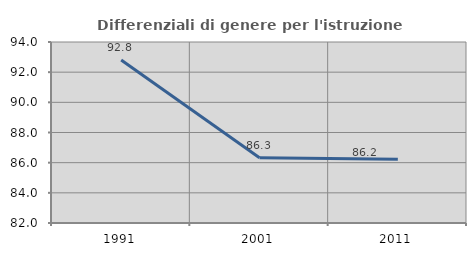
| Category | Differenziali di genere per l'istruzione superiore |
|---|---|
| 1991.0 | 92.801 |
| 2001.0 | 86.326 |
| 2011.0 | 86.218 |